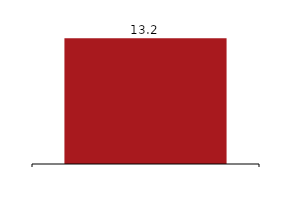
| Category | Profit for the period |
|---|---|
|  | 13226 |